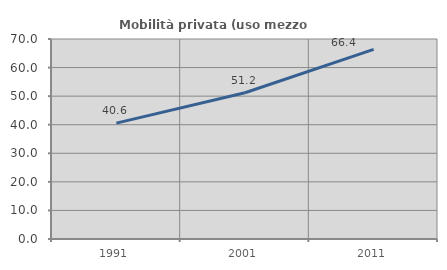
| Category | Mobilità privata (uso mezzo privato) |
|---|---|
| 1991.0 | 40.566 |
| 2001.0 | 51.194 |
| 2011.0 | 66.377 |